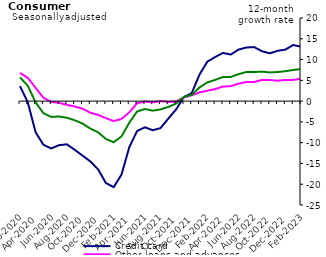
| Category | Credit card | Other loans and advances | Total |
|---|---|---|---|
| Feb-2020 | 3.6 | 6.8 | 5.7 |
| Mar-2020 | -0.3 | 5.6 | 3.7 |
| Apr-2020 | -7.5 | 3.2 | -0.3 |
| May-2020 | -10.5 | 0.8 | -2.9 |
| Jun-2020 | -11.4 | -0.2 | -3.8 |
| Jul-2020 | -10.6 | -0.4 | -3.7 |
| Aug-2020 | -10.4 | -0.9 | -4 |
| Sep-2020 | -11.7 | -1.3 | -4.6 |
| Oct-2020 | -13.1 | -1.8 | -5.4 |
| Nov-2020 | -14.5 | -2.8 | -6.6 |
| Dec-2020 | -16.4 | -3.3 | -7.5 |
| Jan-2021 | -19.7 | -4.1 | -9.1 |
| Feb-2021 | -20.7 | -4.8 | -9.9 |
| Mar-2021 | -17.7 | -4.3 | -8.5 |
| Apr-2021 | -11.1 | -2.7 | -5.2 |
| May-2021 | -7.2 | -0.5 | -2.5 |
| Jun-2021 | -6.3 | -0.1 | -1.9 |
| Jul-2021 | -7 | -0.3 | -2.3 |
| Aug-2021 | -6.5 | 0 | -2 |
| Sep-2021 | -4.2 | -0.2 | -1.4 |
| Oct-2021 | -2 | -0.1 | -0.6 |
| Nov-2021 | 1 | 0.9 | 1 |
| Dec-2021 | 1.9 | 1.4 | 1.5 |
| Jan-2022 | 6.4 | 2.1 | 3.3 |
| Feb-2022 | 9.5 | 2.5 | 4.5 |
| Mar-2022 | 10.6 | 2.9 | 5.1 |
| Apr-2022 | 11.6 | 3.5 | 5.8 |
| May-2022 | 11.2 | 3.6 | 5.8 |
| Jun-2022 | 12.4 | 4.2 | 6.5 |
| Jul-2022 | 12.9 | 4.6 | 7 |
| Aug-2022 | 13 | 4.6 | 7 |
| Sep-2022 | 12 | 5.1 | 7.1 |
| Oct-2022 | 11.5 | 5.1 | 6.9 |
| Nov-2022 | 12.1 | 4.9 | 7 |
| Dec-2022 | 12.4 | 5.1 | 7.2 |
| Jan-2023 | 13.5 | 5.1 | 7.5 |
| Feb-2023 | 13.1 | 5.4 | 7.7 |